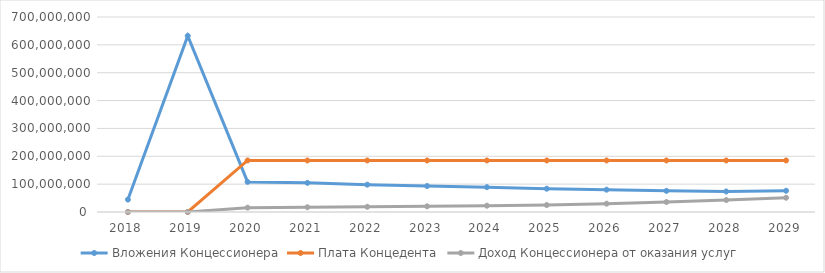
| Category | Вложения Концессионера | Плата Концедента | Доход Концессионера от оказания услуг |
|---|---|---|---|
| 2018.0 | 44509257.122 | 0 | 0 |
| 2019.0 | 632232203.087 | 0 | 0 |
| 2020.0 | 107932596.467 | 185024662.718 | 15660000 |
| 2021.0 | 104657641.343 | 185024662.718 | 17097600 |
| 2022.0 | 98166829.577 | 185024662.718 | 18668416 |
| 2023.0 | 93241708.942 | 185024662.718 | 20388160 |
| 2024.0 | 89168678.161 | 185024662.718 | 22630913.843 |
| 2025.0 | 83653702.457 | 185024662.718 | 25008300.409 |
| 2026.0 | 80136685.065 | 185024662.718 | 29909927.289 |
| 2027.0 | 75919260.13 | 185024662.718 | 35772273.038 |
| 2028.0 | 73658554.531 | 185024662.718 | 42783638.553 |
| 2029.0 | 76197604.596 | 185024662.718 | 51169231.709 |